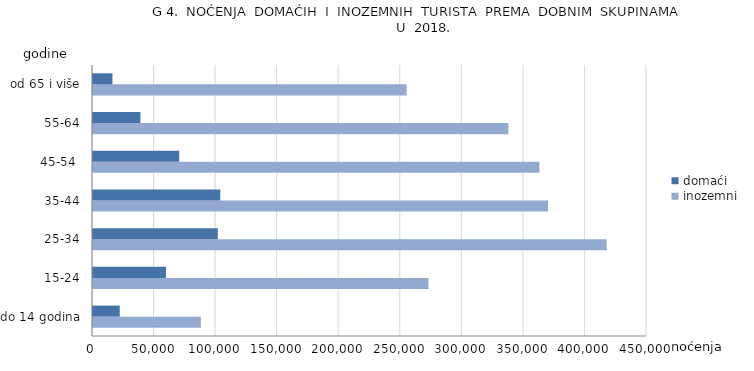
| Category | inozemni | domaći |
|---|---|---|
| do 14 godina | 87567 | 21730 |
| 15-24 | 272502 | 59257 |
| 25-34 | 417255 | 101400 |
| 35-44 | 369608 | 103378 |
| 45-54  | 362608 | 70052 |
| 55-64 | 337419 | 38495 |
| od 65 i više | 254746 | 15800 |